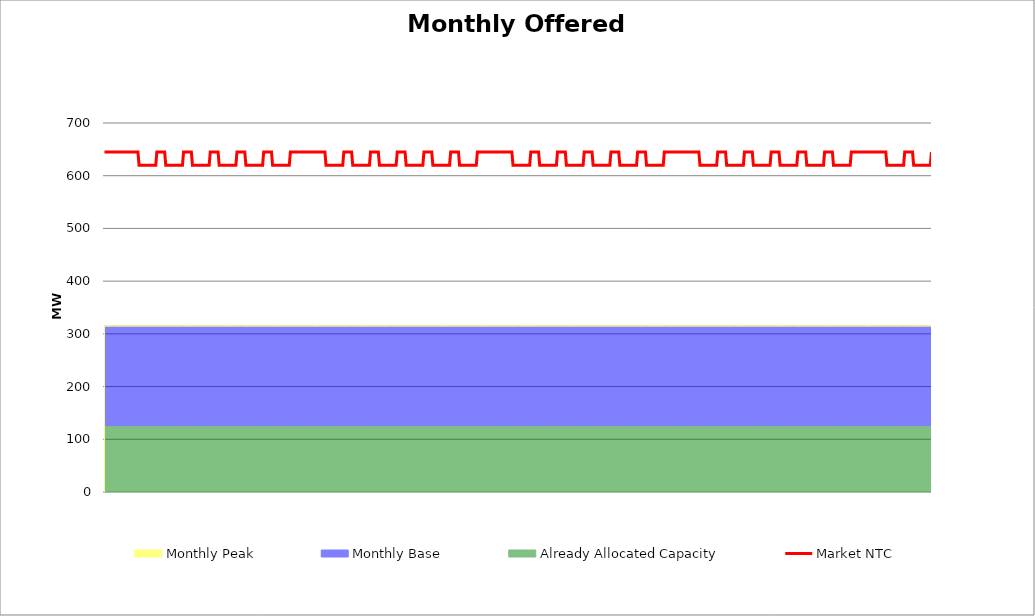
| Category | Market NTC |
|---|---|
| 0 | 645 |
| 1 | 645 |
| 2 | 645 |
| 3 | 645 |
| 4 | 645 |
| 5 | 645 |
| 6 | 645 |
| 7 | 645 |
| 8 | 645 |
| 9 | 645 |
| 10 | 645 |
| 11 | 645 |
| 12 | 645 |
| 13 | 645 |
| 14 | 645 |
| 15 | 645 |
| 16 | 645 |
| 17 | 645 |
| 18 | 645 |
| 19 | 645 |
| 20 | 645 |
| 21 | 645 |
| 22 | 645 |
| 23 | 645 |
| 24 | 645 |
| 25 | 645 |
| 26 | 645 |
| 27 | 645 |
| 28 | 645 |
| 29 | 645 |
| 30 | 645 |
| 31 | 620 |
| 32 | 620 |
| 33 | 620 |
| 34 | 620 |
| 35 | 620 |
| 36 | 620 |
| 37 | 620 |
| 38 | 620 |
| 39 | 620 |
| 40 | 620 |
| 41 | 620 |
| 42 | 620 |
| 43 | 620 |
| 44 | 620 |
| 45 | 620 |
| 46 | 620 |
| 47 | 645 |
| 48 | 645 |
| 49 | 645 |
| 50 | 645 |
| 51 | 645 |
| 52 | 645 |
| 53 | 645 |
| 54 | 645 |
| 55 | 620 |
| 56 | 620 |
| 57 | 620 |
| 58 | 620 |
| 59 | 620 |
| 60 | 620 |
| 61 | 620 |
| 62 | 620 |
| 63 | 620 |
| 64 | 620 |
| 65 | 620 |
| 66 | 620 |
| 67 | 620 |
| 68 | 620 |
| 69 | 620 |
| 70 | 620 |
| 71 | 645 |
| 72 | 645 |
| 73 | 645 |
| 74 | 645 |
| 75 | 645 |
| 76 | 645 |
| 77 | 645 |
| 78 | 645 |
| 79 | 620 |
| 80 | 620 |
| 81 | 620 |
| 82 | 620 |
| 83 | 620 |
| 84 | 620 |
| 85 | 620 |
| 86 | 620 |
| 87 | 620 |
| 88 | 620 |
| 89 | 620 |
| 90 | 620 |
| 91 | 620 |
| 92 | 620 |
| 93 | 620 |
| 94 | 620 |
| 95 | 645 |
| 96 | 645 |
| 97 | 645 |
| 98 | 645 |
| 99 | 645 |
| 100 | 645 |
| 101 | 645 |
| 102 | 645 |
| 103 | 620 |
| 104 | 620 |
| 105 | 620 |
| 106 | 620 |
| 107 | 620 |
| 108 | 620 |
| 109 | 620 |
| 110 | 620 |
| 111 | 620 |
| 112 | 620 |
| 113 | 620 |
| 114 | 620 |
| 115 | 620 |
| 116 | 620 |
| 117 | 620 |
| 118 | 620 |
| 119 | 645 |
| 120 | 645 |
| 121 | 645 |
| 122 | 645 |
| 123 | 645 |
| 124 | 645 |
| 125 | 645 |
| 126 | 645 |
| 127 | 620 |
| 128 | 620 |
| 129 | 620 |
| 130 | 620 |
| 131 | 620 |
| 132 | 620 |
| 133 | 620 |
| 134 | 620 |
| 135 | 620 |
| 136 | 620 |
| 137 | 620 |
| 138 | 620 |
| 139 | 620 |
| 140 | 620 |
| 141 | 620 |
| 142 | 620 |
| 143 | 645 |
| 144 | 645 |
| 145 | 645 |
| 146 | 645 |
| 147 | 645 |
| 148 | 645 |
| 149 | 645 |
| 150 | 645 |
| 151 | 620 |
| 152 | 620 |
| 153 | 620 |
| 154 | 620 |
| 155 | 620 |
| 156 | 620 |
| 157 | 620 |
| 158 | 620 |
| 159 | 620 |
| 160 | 620 |
| 161 | 620 |
| 162 | 620 |
| 163 | 620 |
| 164 | 620 |
| 165 | 620 |
| 166 | 620 |
| 167 | 645 |
| 168 | 645 |
| 169 | 645 |
| 170 | 645 |
| 171 | 645 |
| 172 | 645 |
| 173 | 645 |
| 174 | 645 |
| 175 | 645 |
| 176 | 645 |
| 177 | 645 |
| 178 | 645 |
| 179 | 645 |
| 180 | 645 |
| 181 | 645 |
| 182 | 645 |
| 183 | 645 |
| 184 | 645 |
| 185 | 645 |
| 186 | 645 |
| 187 | 645 |
| 188 | 645 |
| 189 | 645 |
| 190 | 645 |
| 191 | 645 |
| 192 | 645 |
| 193 | 645 |
| 194 | 645 |
| 195 | 645 |
| 196 | 645 |
| 197 | 645 |
| 198 | 645 |
| 199 | 620 |
| 200 | 620 |
| 201 | 620 |
| 202 | 620 |
| 203 | 620 |
| 204 | 620 |
| 205 | 620 |
| 206 | 620 |
| 207 | 620 |
| 208 | 620 |
| 209 | 620 |
| 210 | 620 |
| 211 | 620 |
| 212 | 620 |
| 213 | 620 |
| 214 | 620 |
| 215 | 645 |
| 216 | 645 |
| 217 | 645 |
| 218 | 645 |
| 219 | 645 |
| 220 | 645 |
| 221 | 645 |
| 222 | 645 |
| 223 | 620 |
| 224 | 620 |
| 225 | 620 |
| 226 | 620 |
| 227 | 620 |
| 228 | 620 |
| 229 | 620 |
| 230 | 620 |
| 231 | 620 |
| 232 | 620 |
| 233 | 620 |
| 234 | 620 |
| 235 | 620 |
| 236 | 620 |
| 237 | 620 |
| 238 | 620 |
| 239 | 645 |
| 240 | 645 |
| 241 | 645 |
| 242 | 645 |
| 243 | 645 |
| 244 | 645 |
| 245 | 645 |
| 246 | 645 |
| 247 | 620 |
| 248 | 620 |
| 249 | 620 |
| 250 | 620 |
| 251 | 620 |
| 252 | 620 |
| 253 | 620 |
| 254 | 620 |
| 255 | 620 |
| 256 | 620 |
| 257 | 620 |
| 258 | 620 |
| 259 | 620 |
| 260 | 620 |
| 261 | 620 |
| 262 | 620 |
| 263 | 645 |
| 264 | 645 |
| 265 | 645 |
| 266 | 645 |
| 267 | 645 |
| 268 | 645 |
| 269 | 645 |
| 270 | 645 |
| 271 | 620 |
| 272 | 620 |
| 273 | 620 |
| 274 | 620 |
| 275 | 620 |
| 276 | 620 |
| 277 | 620 |
| 278 | 620 |
| 279 | 620 |
| 280 | 620 |
| 281 | 620 |
| 282 | 620 |
| 283 | 620 |
| 284 | 620 |
| 285 | 620 |
| 286 | 620 |
| 287 | 645 |
| 288 | 645 |
| 289 | 645 |
| 290 | 645 |
| 291 | 645 |
| 292 | 645 |
| 293 | 645 |
| 294 | 645 |
| 295 | 620 |
| 296 | 620 |
| 297 | 620 |
| 298 | 620 |
| 299 | 620 |
| 300 | 620 |
| 301 | 620 |
| 302 | 620 |
| 303 | 620 |
| 304 | 620 |
| 305 | 620 |
| 306 | 620 |
| 307 | 620 |
| 308 | 620 |
| 309 | 620 |
| 310 | 620 |
| 311 | 645 |
| 312 | 645 |
| 313 | 645 |
| 314 | 645 |
| 315 | 645 |
| 316 | 645 |
| 317 | 645 |
| 318 | 645 |
| 319 | 620 |
| 320 | 620 |
| 321 | 620 |
| 322 | 620 |
| 323 | 620 |
| 324 | 620 |
| 325 | 620 |
| 326 | 620 |
| 327 | 620 |
| 328 | 620 |
| 329 | 620 |
| 330 | 620 |
| 331 | 620 |
| 332 | 620 |
| 333 | 620 |
| 334 | 620 |
| 335 | 645 |
| 336 | 645 |
| 337 | 645 |
| 338 | 645 |
| 339 | 645 |
| 340 | 645 |
| 341 | 645 |
| 342 | 645 |
| 343 | 645 |
| 344 | 645 |
| 345 | 645 |
| 346 | 645 |
| 347 | 645 |
| 348 | 645 |
| 349 | 645 |
| 350 | 645 |
| 351 | 645 |
| 352 | 645 |
| 353 | 645 |
| 354 | 645 |
| 355 | 645 |
| 356 | 645 |
| 357 | 645 |
| 358 | 645 |
| 359 | 645 |
| 360 | 645 |
| 361 | 645 |
| 362 | 645 |
| 363 | 645 |
| 364 | 645 |
| 365 | 645 |
| 366 | 645 |
| 367 | 620 |
| 368 | 620 |
| 369 | 620 |
| 370 | 620 |
| 371 | 620 |
| 372 | 620 |
| 373 | 620 |
| 374 | 620 |
| 375 | 620 |
| 376 | 620 |
| 377 | 620 |
| 378 | 620 |
| 379 | 620 |
| 380 | 620 |
| 381 | 620 |
| 382 | 620 |
| 383 | 645 |
| 384 | 645 |
| 385 | 645 |
| 386 | 645 |
| 387 | 645 |
| 388 | 645 |
| 389 | 645 |
| 390 | 645 |
| 391 | 620 |
| 392 | 620 |
| 393 | 620 |
| 394 | 620 |
| 395 | 620 |
| 396 | 620 |
| 397 | 620 |
| 398 | 620 |
| 399 | 620 |
| 400 | 620 |
| 401 | 620 |
| 402 | 620 |
| 403 | 620 |
| 404 | 620 |
| 405 | 620 |
| 406 | 620 |
| 407 | 645 |
| 408 | 645 |
| 409 | 645 |
| 410 | 645 |
| 411 | 645 |
| 412 | 645 |
| 413 | 645 |
| 414 | 645 |
| 415 | 620 |
| 416 | 620 |
| 417 | 620 |
| 418 | 620 |
| 419 | 620 |
| 420 | 620 |
| 421 | 620 |
| 422 | 620 |
| 423 | 620 |
| 424 | 620 |
| 425 | 620 |
| 426 | 620 |
| 427 | 620 |
| 428 | 620 |
| 429 | 620 |
| 430 | 620 |
| 431 | 645 |
| 432 | 645 |
| 433 | 645 |
| 434 | 645 |
| 435 | 645 |
| 436 | 645 |
| 437 | 645 |
| 438 | 645 |
| 439 | 620 |
| 440 | 620 |
| 441 | 620 |
| 442 | 620 |
| 443 | 620 |
| 444 | 620 |
| 445 | 620 |
| 446 | 620 |
| 447 | 620 |
| 448 | 620 |
| 449 | 620 |
| 450 | 620 |
| 451 | 620 |
| 452 | 620 |
| 453 | 620 |
| 454 | 620 |
| 455 | 645 |
| 456 | 645 |
| 457 | 645 |
| 458 | 645 |
| 459 | 645 |
| 460 | 645 |
| 461 | 645 |
| 462 | 645 |
| 463 | 620 |
| 464 | 620 |
| 465 | 620 |
| 466 | 620 |
| 467 | 620 |
| 468 | 620 |
| 469 | 620 |
| 470 | 620 |
| 471 | 620 |
| 472 | 620 |
| 473 | 620 |
| 474 | 620 |
| 475 | 620 |
| 476 | 620 |
| 477 | 620 |
| 478 | 620 |
| 479 | 645 |
| 480 | 645 |
| 481 | 645 |
| 482 | 645 |
| 483 | 645 |
| 484 | 645 |
| 485 | 645 |
| 486 | 645 |
| 487 | 620 |
| 488 | 620 |
| 489 | 620 |
| 490 | 620 |
| 491 | 620 |
| 492 | 620 |
| 493 | 620 |
| 494 | 620 |
| 495 | 620 |
| 496 | 620 |
| 497 | 620 |
| 498 | 620 |
| 499 | 620 |
| 500 | 620 |
| 501 | 620 |
| 502 | 620 |
| 503 | 645 |
| 504 | 645 |
| 505 | 645 |
| 506 | 645 |
| 507 | 645 |
| 508 | 645 |
| 509 | 645 |
| 510 | 645 |
| 511 | 645 |
| 512 | 645 |
| 513 | 645 |
| 514 | 645 |
| 515 | 645 |
| 516 | 645 |
| 517 | 645 |
| 518 | 645 |
| 519 | 645 |
| 520 | 645 |
| 521 | 645 |
| 522 | 645 |
| 523 | 645 |
| 524 | 645 |
| 525 | 645 |
| 526 | 645 |
| 527 | 645 |
| 528 | 645 |
| 529 | 645 |
| 530 | 645 |
| 531 | 645 |
| 532 | 645 |
| 533 | 645 |
| 534 | 645 |
| 535 | 620 |
| 536 | 620 |
| 537 | 620 |
| 538 | 620 |
| 539 | 620 |
| 540 | 620 |
| 541 | 620 |
| 542 | 620 |
| 543 | 620 |
| 544 | 620 |
| 545 | 620 |
| 546 | 620 |
| 547 | 620 |
| 548 | 620 |
| 549 | 620 |
| 550 | 620 |
| 551 | 645 |
| 552 | 645 |
| 553 | 645 |
| 554 | 645 |
| 555 | 645 |
| 556 | 645 |
| 557 | 645 |
| 558 | 645 |
| 559 | 620 |
| 560 | 620 |
| 561 | 620 |
| 562 | 620 |
| 563 | 620 |
| 564 | 620 |
| 565 | 620 |
| 566 | 620 |
| 567 | 620 |
| 568 | 620 |
| 569 | 620 |
| 570 | 620 |
| 571 | 620 |
| 572 | 620 |
| 573 | 620 |
| 574 | 620 |
| 575 | 645 |
| 576 | 645 |
| 577 | 645 |
| 578 | 645 |
| 579 | 645 |
| 580 | 645 |
| 581 | 645 |
| 582 | 645 |
| 583 | 620 |
| 584 | 620 |
| 585 | 620 |
| 586 | 620 |
| 587 | 620 |
| 588 | 620 |
| 589 | 620 |
| 590 | 620 |
| 591 | 620 |
| 592 | 620 |
| 593 | 620 |
| 594 | 620 |
| 595 | 620 |
| 596 | 620 |
| 597 | 620 |
| 598 | 620 |
| 599 | 645 |
| 600 | 645 |
| 601 | 645 |
| 602 | 645 |
| 603 | 645 |
| 604 | 645 |
| 605 | 645 |
| 606 | 645 |
| 607 | 620 |
| 608 | 620 |
| 609 | 620 |
| 610 | 620 |
| 611 | 620 |
| 612 | 620 |
| 613 | 620 |
| 614 | 620 |
| 615 | 620 |
| 616 | 620 |
| 617 | 620 |
| 618 | 620 |
| 619 | 620 |
| 620 | 620 |
| 621 | 620 |
| 622 | 620 |
| 623 | 645 |
| 624 | 645 |
| 625 | 645 |
| 626 | 645 |
| 627 | 645 |
| 628 | 645 |
| 629 | 645 |
| 630 | 645 |
| 631 | 620 |
| 632 | 620 |
| 633 | 620 |
| 634 | 620 |
| 635 | 620 |
| 636 | 620 |
| 637 | 620 |
| 638 | 620 |
| 639 | 620 |
| 640 | 620 |
| 641 | 620 |
| 642 | 620 |
| 643 | 620 |
| 644 | 620 |
| 645 | 620 |
| 646 | 620 |
| 647 | 645 |
| 648 | 645 |
| 649 | 645 |
| 650 | 645 |
| 651 | 645 |
| 652 | 645 |
| 653 | 645 |
| 654 | 645 |
| 655 | 620 |
| 656 | 620 |
| 657 | 620 |
| 658 | 620 |
| 659 | 620 |
| 660 | 620 |
| 661 | 620 |
| 662 | 620 |
| 663 | 620 |
| 664 | 620 |
| 665 | 620 |
| 666 | 620 |
| 667 | 620 |
| 668 | 620 |
| 669 | 620 |
| 670 | 620 |
| 671 | 645 |
| 672 | 645 |
| 673 | 645 |
| 674 | 645 |
| 675 | 645 |
| 676 | 645 |
| 677 | 645 |
| 678 | 645 |
| 679 | 645 |
| 680 | 645 |
| 681 | 645 |
| 682 | 645 |
| 683 | 645 |
| 684 | 645 |
| 685 | 645 |
| 686 | 645 |
| 687 | 645 |
| 688 | 645 |
| 689 | 645 |
| 690 | 645 |
| 691 | 645 |
| 692 | 645 |
| 693 | 645 |
| 694 | 645 |
| 695 | 645 |
| 696 | 645 |
| 697 | 645 |
| 698 | 645 |
| 699 | 645 |
| 700 | 645 |
| 701 | 645 |
| 702 | 645 |
| 703 | 620 |
| 704 | 620 |
| 705 | 620 |
| 706 | 620 |
| 707 | 620 |
| 708 | 620 |
| 709 | 620 |
| 710 | 620 |
| 711 | 620 |
| 712 | 620 |
| 713 | 620 |
| 714 | 620 |
| 715 | 620 |
| 716 | 620 |
| 717 | 620 |
| 718 | 620 |
| 719 | 645 |
| 720 | 645 |
| 721 | 645 |
| 722 | 645 |
| 723 | 645 |
| 724 | 645 |
| 725 | 645 |
| 726 | 645 |
| 727 | 620 |
| 728 | 620 |
| 729 | 620 |
| 730 | 620 |
| 731 | 620 |
| 732 | 620 |
| 733 | 620 |
| 734 | 620 |
| 735 | 620 |
| 736 | 620 |
| 737 | 620 |
| 738 | 620 |
| 739 | 620 |
| 740 | 620 |
| 741 | 620 |
| 742 | 620 |
| 743 | 645 |